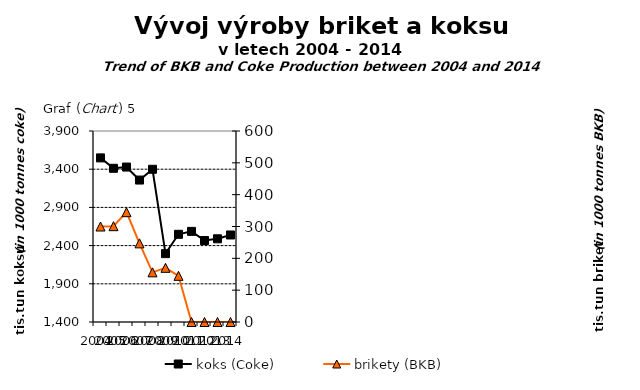
| Category | koks (Coke) |
|---|---|
| 2004.0 | 3548 |
| 2005.0 | 3412 |
| 2006.0 | 3428 |
| 2007.0 | 3258 |
| 2008.0 | 3399 |
| 2009.0 | 2294.799 |
| 2010.0 | 2548 |
| 2011.0 | 2586 |
| 2012.0 | 2466.636 |
| 2013.0 | 2489 |
| 2014.0 | 2539.05 |